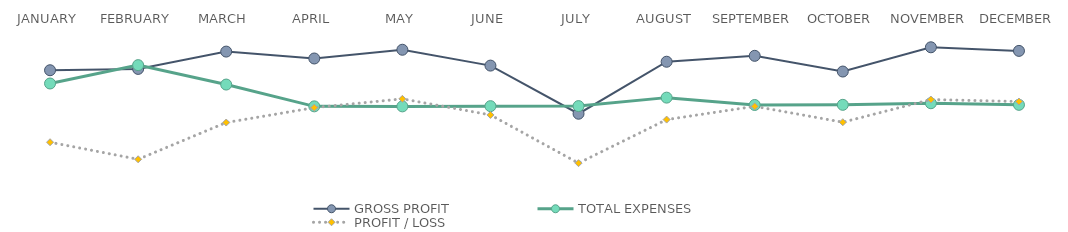
| Category | GROSS PROFIT | TOTAL EXPENSES | PROFIT / LOSS |
|---|---|---|---|
| JANUARY | 72564 | 61281 | 11283 |
| FEBRUARY | 73678 | 76903 | -3225 |
| MARCH | 88429 | 60375 | 28054 |
| APRIL | 82563 | 41833 | 40730 |
| MAY | 90001 | 41805 | 48196 |
| JUNE | 76514 | 41994 | 34520 |
| JULY | 35551 | 42059 | -6508 |
| AUGUST | 79802 | 49250 | 30552 |
| SEPTEMBER | 84831 | 42993 | 41838 |
| OCTOBER | 71450 | 43125 | 28325 |
| NOVEMBER | 92092 | 44473 | 47619 |
| DECEMBER | 89024 | 43110 | 45914 |